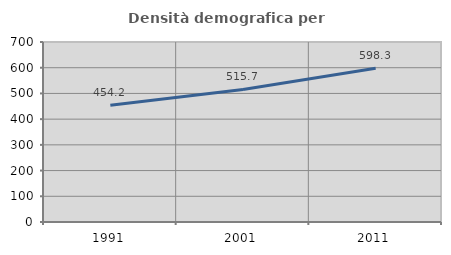
| Category | Densità demografica |
|---|---|
| 1991.0 | 454.241 |
| 2001.0 | 515.682 |
| 2011.0 | 598.32 |